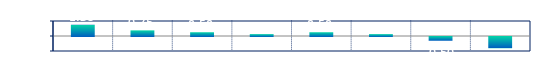
| Category | Series 0 |
|---|---|
| 0 | 1.5 |
| 1 | 0.75 |
| 2 | 0.5 |
| 3 | 0.25 |
| 4 | 0.5 |
| 5 | 0.25 |
| 6 | -0.5 |
| 7 | -1.5 |